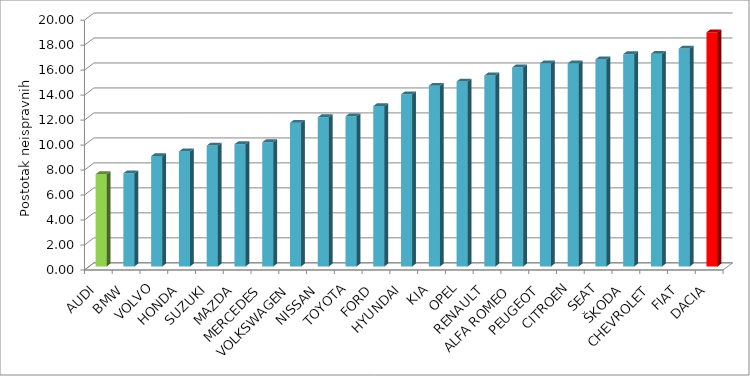
| Category | Series 4 |
|---|---|
| AUDI | 7.386 |
| BMW | 7.46 |
| VOLVO | 8.833 |
| HONDA | 9.206 |
| SUZUKI | 9.674 |
| MAZDA | 9.784 |
| MERCEDES | 9.945 |
| VOLKSWAGEN | 11.499 |
| NISSAN | 11.944 |
| TOYOTA | 12.018 |
| FORD | 12.836 |
| HYUNDAI | 13.776 |
| KIA | 14.464 |
| OPEL | 14.805 |
| RENAULT | 15.288 |
| ALFA ROMEO | 15.939 |
| PEUGEOT | 16.249 |
| CITROEN | 16.252 |
| SEAT | 16.571 |
| ŠKODA | 16.994 |
| CHEVROLET | 17.027 |
| FIAT | 17.441 |
| DACIA | 18.742 |